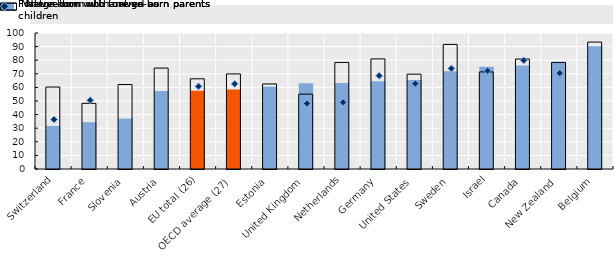
| Category | Native-born with foreign-born parents | Native-born with native-born parents |
|---|---|---|
| Switzerland | 31.646 | 60.264 |
| France | 34.414 | 48.284 |
| Slovenia | 37.097 | 62.098 |
| Austria | 57.364 | 74.21 |
| EU total (26) | 57.596 | 66.316 |
| OECD average (27) | 58.52 | 69.927 |
| Estonia | 60.55 | 62.527 |
| United Kingdom | 63.102 | 55.053 |
| Netherlands | 63.198 | 78.344 |
| Germany | 64.451 | 80.94 |
| United States | 65.52 | 69.73 |
| Sweden | 71.832 | 91.599 |
| Israel | 75.268 | 71.381 |
| Canada | 76.185 | 80.86 |
| New Zealand | 78.571 | 78.369 |
| Belgium | 90.234 | 93.318 |